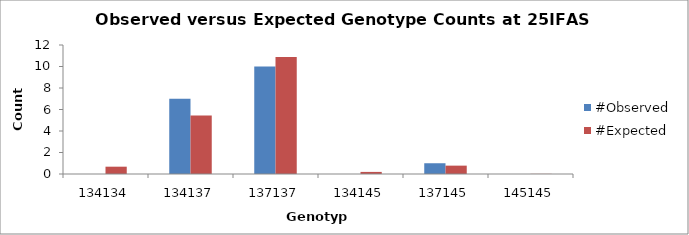
| Category | #Observed | #Expected |
|---|---|---|
| 134134.0 | 0 | 0.681 |
| 134137.0 | 7 | 5.444 |
| 137137.0 | 10 | 10.889 |
| 134145.0 | 0 | 0.194 |
| 137145.0 | 1 | 0.778 |
| 145145.0 | 0 | 0.014 |